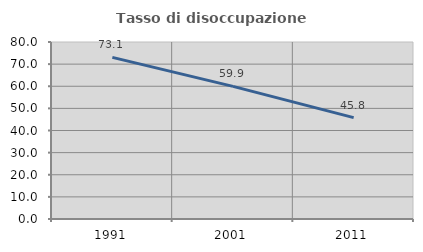
| Category | Tasso di disoccupazione giovanile  |
|---|---|
| 1991.0 | 73.062 |
| 2001.0 | 59.941 |
| 2011.0 | 45.833 |